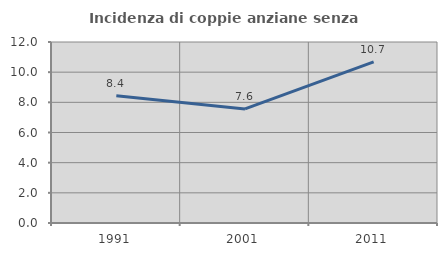
| Category | Incidenza di coppie anziane senza figli  |
|---|---|
| 1991.0 | 8.443 |
| 2001.0 | 7.565 |
| 2011.0 | 10.678 |